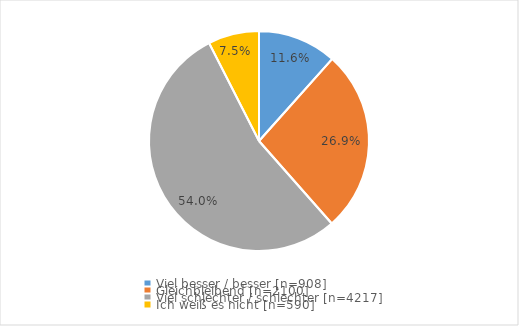
| Category | Series 0 |
|---|---|
| Viel besser / besser [n=908] | 0.116 |
| Gleichbleibend [n=2100] | 0.269 |
| Viel schlechter / schlechter [n=4217] | 0.54 |
| Ich weiß es nicht [n=590] | 0.075 |